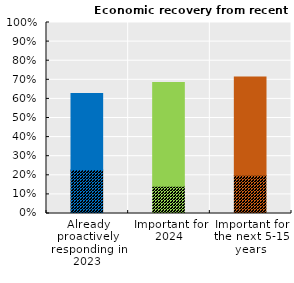
| Category | Economic recovery from recent shocks | Series 1 |
|---|---|---|
| Already proactively responding in 2023 | 0.229 | 0.4 |
| Important for
2024 | 0.143 | 0.543 |
| Important for
the next 5-15 years | 0.2 | 0.514 |